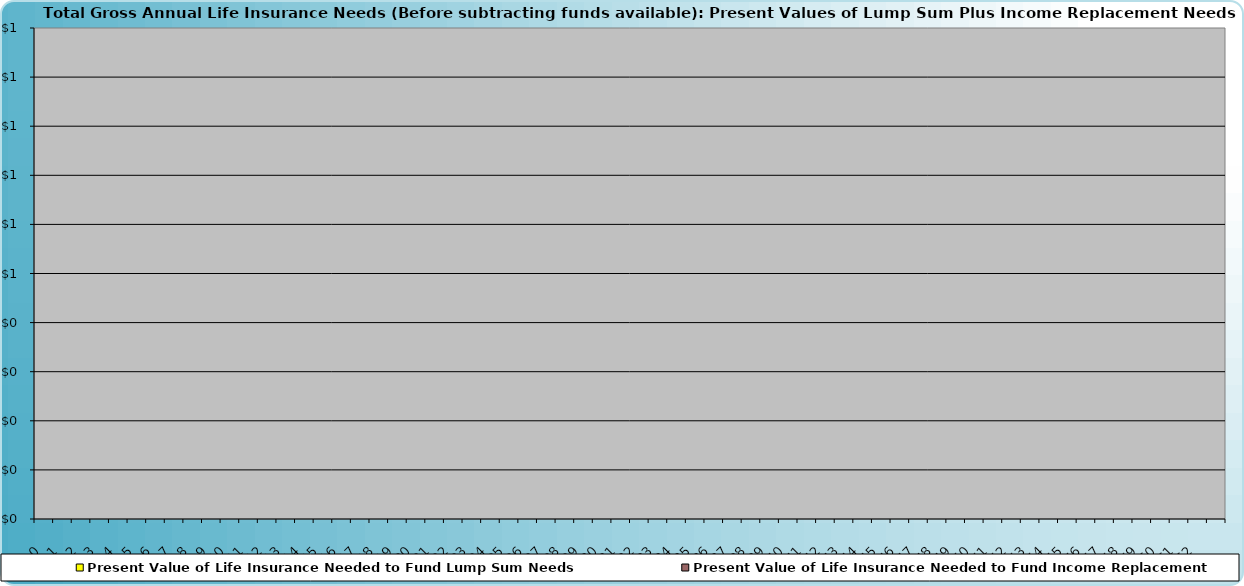
| Category | Present Value of Life Insurance Needed to Fund Income Replacement | Present Value of Life Insurance Needed to Fund Lump Sum Needs |
|---|---|---|
| 0.0 | 0 | 0 |
| 1.0 | 0 | 0 |
| 2.0 | 0 | 0 |
| 3.0 | 0 | 0 |
| 4.0 | 0 | 0 |
| 5.0 | 0 | 0 |
| 6.0 | 0 | 0 |
| 7.0 | 0 | 0 |
| 8.0 | 0 | 0 |
| 9.0 | 0 | 0 |
| 10.0 | 0 | 0 |
| 11.0 | 0 | 0 |
| 12.0 | 0 | 0 |
| 13.0 | 0 | 0 |
| 14.0 | 0 | 0 |
| 15.0 | 0 | 0 |
| 16.0 | 0 | 0 |
| 17.0 | 0 | 0 |
| 18.0 | 0 | 0 |
| 19.0 | 0 | 0 |
| 20.0 | 0 | 0 |
| 21.0 | 0 | 0 |
| 22.0 | 0 | 0 |
| 23.0 | 0 | 0 |
| 24.0 | 0 | 0 |
| 25.0 | 0 | 0 |
| 26.0 | 0 | 0 |
| 27.0 | 0 | 0 |
| 28.0 | 0 | 0 |
| 29.0 | 0 | 0 |
| 30.0 | 0 | 0 |
| 31.0 | 0 | 0 |
| 32.0 | 0 | 0 |
| 33.0 | 0 | 0 |
| 34.0 | 0 | 0 |
| 35.0 | 0 | 0 |
| 36.0 | 0 | 0 |
| 37.0 | 0 | 0 |
| 38.0 | 0 | 0 |
| 39.0 | 0 | 0 |
| 40.0 | 0 | 0 |
| 41.0 | 0 | 0 |
| 42.0 | 0 | 0 |
| 43.0 | 0 | 0 |
| 44.0 | 0 | 0 |
| 45.0 | 0 | 0 |
| 46.0 | 0 | 0 |
| 47.0 | 0 | 0 |
| 48.0 | 0 | 0 |
| 49.0 | 0 | 0 |
| 50.0 | 0 | 0 |
| 51.0 | 0 | 0 |
| 52.0 | 0 | 0 |
| 53.0 | 0 | 0 |
| 54.0 | 0 | 0 |
| 55.0 | 0 | 0 |
| 56.0 | 0 | 0 |
| 57.0 | 0 | 0 |
| 58.0 | 0 | 0 |
| 59.0 | 0 | 0 |
| 60.0 | 0 | 0 |
| 61.0 | 0 | 0 |
| 62.0 | 0 | 0 |